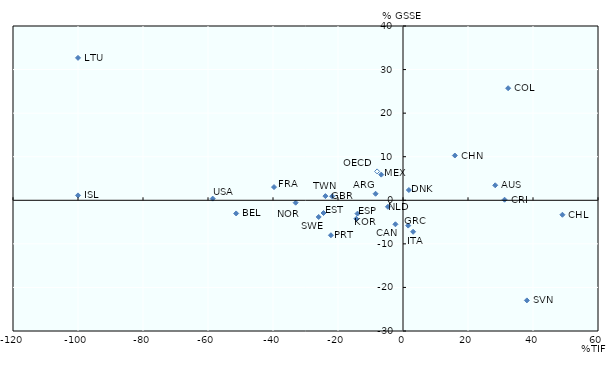
| Category | General Services Support Estimate (GSSE) |
|---|---|
| -100.0 | 1.124 |
| -100.0 | 32.685 |
| -58.5553327746323 | 0.383 |
| -51.3344000658696 | -3.021 |
| -39.6837082212129 | 3.028 |
| -33.0264879538268 | -0.554 |
| -25.9417025600002 | -3.826 |
| -24.4594563562336 | -2.921 |
| -23.8758690553367 | 0.96 |
| -22.1693653796741 | -8.026 |
| -21.8014292877244 | 0.922 |
| -14.3600886770399 | -4.255 |
| -14.0045328392818 | -3.061 |
| -8.44159017297249 | 1.498 |
| -7.9711041801788 | 6.628 |
| -6.69072793632408 | 5.887 |
| -4.6332179893542 | -1.491 |
| -2.32750604203843 | -5.51 |
| 1.5971792455622 | -5.806 |
| 1.80401042210911 | 2.352 |
| 3.10966931950893 | -7.226 |
| 28.3752194994264 | 3.441 |
| 31.2470453362964 | 0.132 |
| 32.3469904156014 | 25.722 |
| 38.1144283385631 | -22.976 |
| 49.0525445705003 | -3.32 |
| 15.9610144883236 | 10.273 |